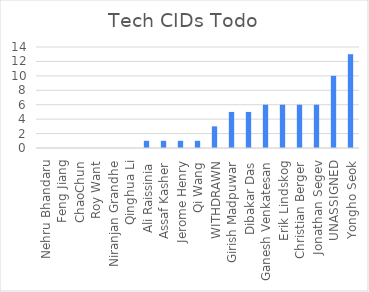
| Category | Series 0 |
|---|---|
| Nehru Bhandaru | 0 |
| Feng Jiang | 0 |
| ChaoChun | 0 |
| Roy Want | 0 |
| Niranjan Grandhe | 0 |
| Qinghua Li | 0 |
| Ali Raissinia | 1 |
| Assaf Kasher | 1 |
| Jerome Henry | 1 |
| Qi Wang | 1 |
| WITHDRAWN | 3 |
| Girish Madpuwar | 5 |
| Dibakar Das | 5 |
| Ganesh Venkatesan | 6 |
| Erik Lindskog | 6 |
| Christian Berger | 6 |
| Jonathan Segev | 6 |
| UNASSIGNED | 10 |
| Yongho Seok | 13 |